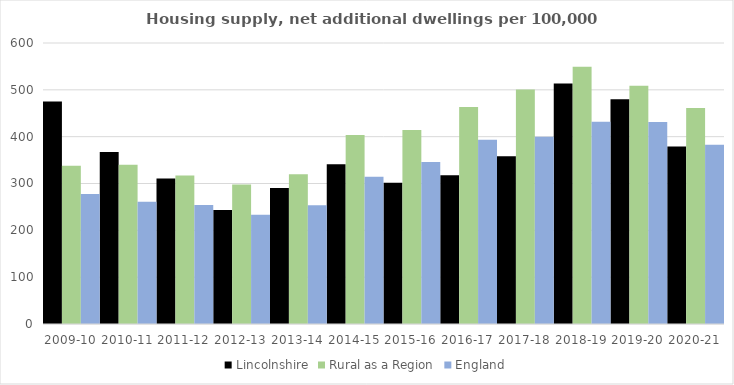
| Category | Lincolnshire | Rural as a Region | England |
|---|---|---|---|
| 2009-10 | 475.199 | 337.852 | 277.548 |
| 2010-11 | 367.095 | 340.105 | 260.994 |
| 2011-12 | 310.87 | 317.04 | 254.007 |
| 2012-13 | 243.331 | 297.763 | 233.153 |
| 2013-14 | 290.536 | 319.835 | 253.602 |
| 2014-15 | 341.037 | 403.796 | 314.256 |
| 2015-16 | 301.621 | 414.091 | 346.154 |
| 2016-17 | 317.799 | 463.209 | 393.256 |
| 2017-18 | 358.241 | 500.68 | 399.646 |
| 2018-19 | 513.473 | 549.491 | 432.099 |
| 2019-20 | 480.016 | 508.493 | 431.187 |
| 2020-21 | 379.078 | 461.114 | 382.827 |